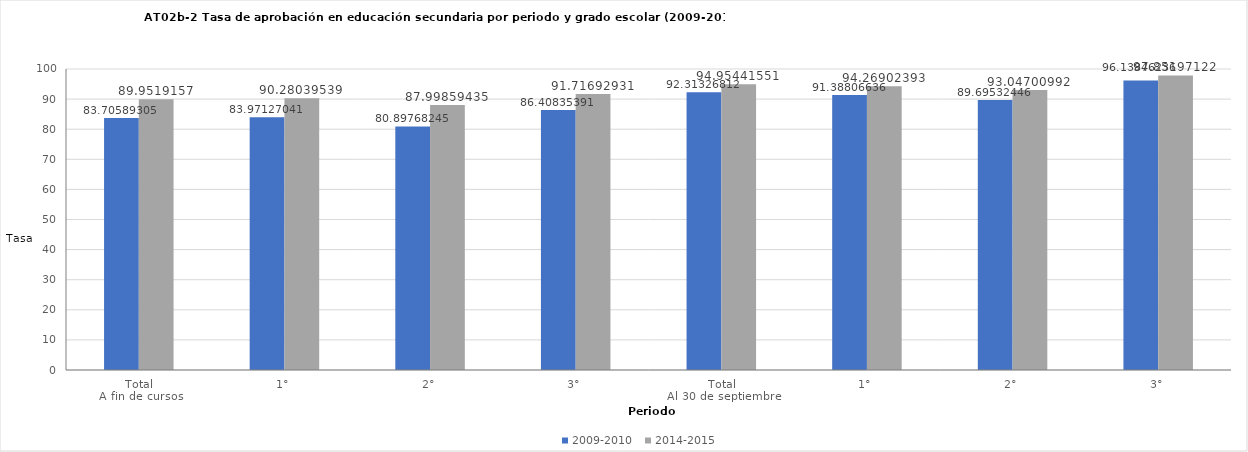
| Category | 2009-2010 | 2014-2015 |
|---|---|---|
| 0 | 83.706 | 89.952 |
| 1 | 83.971 | 90.28 |
| 2 | 80.898 | 87.999 |
| 3 | 86.408 | 91.717 |
| 4 | 92.313 | 94.954 |
| 5 | 91.388 | 94.269 |
| 6 | 89.695 | 93.047 |
| 7 | 96.138 | 97.852 |